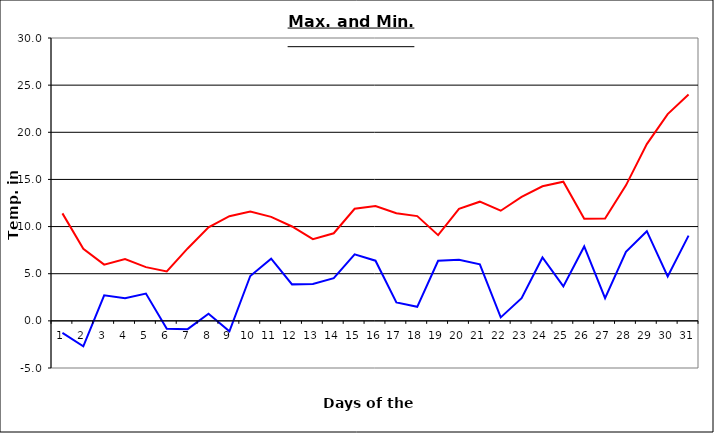
| Category | Series 0 | Series 1 |
|---|---|---|
| 0 | 11.4 | -1.28 |
| 1 | 7.64 | -2.7 |
| 2 | 5.96 | 2.71 |
| 3 | 6.55 | 2.41 |
| 4 | 5.7 | 2.89 |
| 5 | 5.25 | -0.83 |
| 6 | 7.68 | -0.88 |
| 7 | 9.92 | 0.76 |
| 8 | 11.1 | -1.1 |
| 9 | 11.59 | 4.76 |
| 10 | 11.03 | 6.6 |
| 11 | 10.01 | 3.87 |
| 12 | 8.67 | 3.9 |
| 13 | 9.29 | 4.52 |
| 14 | 11.89 | 7.06 |
| 15 | 12.18 | 6.38 |
| 16 | 11.41 | 1.96 |
| 17 | 11.11 | 1.49 |
| 18 | 9.09 | 6.37 |
| 19 | 11.88 | 6.48 |
| 20 | 12.64 | 5.99 |
| 21 | 11.68 | 0.37 |
| 22 | 13.14 | 2.4 |
| 23 | 14.27 | 6.72 |
| 24 | 14.76 | 3.65 |
| 25 | 10.82 | 7.89 |
| 26 | 10.86 | 2.4 |
| 27 | 14.37 | 7.33 |
| 28 | 18.75 | 9.51 |
| 29 | 21.93 | 4.72 |
| 30 | 24.01 | 9.04 |